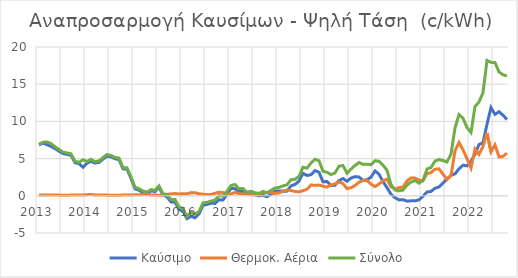
| Category | Καύσιμο | Θερμοκ. Αέρια | Σύνολο |
|---|---|---|---|
| 2013.0 | 6.834 | 0.098 | 6.94 |
| 2013.0 | 7.081 | 0.12 | 7.208 |
| 2013.0 | 6.873 | 0.12 | 7.234 |
| 2013.0 | 6.645 | 0.124 | 7.019 |
| 2013.0 | 6.344 | 0.104 | 6.6 |
| 2013.0 | 6 | 0.094 | 6.233 |
| 2013.0 | 5.672 | 0.075 | 5.873 |
| 2013.0 | 5.566 | 0.074 | 5.763 |
| 2013.0 | 5.441 | 0.092 | 5.649 |
| 2013.0 | 4.459 | 0.104 | 4.64 |
| 2013.0 | 4.32 | 0.112 | 4.503 |
| 2014.0 | 3.838 | 0.096 | 4.838 |
| 2014.0 | 4.385 | 0.152 | 4.621 |
| 2014.0 | 4.632 | 0.177 | 4.903 |
| 2014.0 | 4.405 | 0.111 | 4.595 |
| 2014.0 | 4.494 | 0.117 | 4.691 |
| 2014.0 | 4.928 | 0.106 | 5.135 |
| 2014.0 | 5.33 | 0.095 | 5.543 |
| 2014.0 | 5.23 | 0.074 | 5.417 |
| 2014.0 | 4.982 | 0.073 | 5.166 |
| 2014.0 | 4.873 | 0.084 | 5.065 |
| 2014.0 | 3.62 | 0.095 | 3.771 |
| 2014.0 | 3.583 | 0.108 | 3.763 |
| 2015.0 | 2.34 | 0.098 | 2.522 |
| 2015.0 | 0.94 | 0.137 | 1.158 |
| 2015.0 | 0.741 | 0.156 | 0.964 |
| 2015.0 | 0.419 | 0.16 | 0.651 |
| 2015.0 | 0.262 | 0.174 | 0.481 |
| 2015.0 | 0.665 | 0.11 | 0.835 |
| 2015.0 | 0.576 | 0.101 | 0.745 |
| 2015.0 | 1.163 | 0.08 | 1.343 |
| 2015.0 | 0.102 | 0.068 | 0.262 |
| 2015.0 | -0.146 | 0.208 | 0.167 |
| 2015.0 | -0.832 | 0.251 | -0.498 |
| 2015.0 | -0.864 | 0.302 | -0.49 |
| 2016.0 | -1.807 | 0.252 | -1.494 |
| 2016.0 | -2.111 | 0.277 | -1.747 |
| 2016.0 | -3.067 | 0.266 | -2.748 |
| 2016.0 | -2.759 | 0.427 | -2.246 |
| 2016.0 | -2.942 | 0.414 | -2.473 |
| 2016.0 | -2.435 | 0.274 | -2.106 |
| 2016.0 | -1.275 | 0.205 | -0.958 |
| 2016.0 | -1.158 | 0.168 | -0.884 |
| 2016.0 | -0.995 | 0.182 | -0.708 |
| 2016.0 | -1.025 | 0.338 | -0.584 |
| 2016.0 | -0.538 | 0.482 | 0.033 |
| 2016.0 | -0.565 | 0.437 | -0.055 |
| 2017.0 | 0.214 | 0.262 | 0.604 |
| 2017.0 | 1.011 | 0.246 | 1.387 |
| 2017.0 | 0.952 | 0.454 | 1.514 |
| 2017.0 | 0.55 | 0.296 | 0.953 |
| 2017.0 | 0.636 | 0.252 | 0.981 |
| 2017.0 | 0.196 | 0.201 | 0.477 |
| 2017.0 | 0.339 | 0.146 | 0.606 |
| 2017.0 | 0.122 | 0.152 | 0.4 |
| 2017.0 | -0.011 | 0.217 | 0.323 |
| 2017.0 | 0.056 | 0.414 | 0.594 |
| 2017.0 | -0.129 | 0.452 | 0.4 |
| 2017.0 | 0.188 | 0.449 | 0.725 |
| 2018.0 | 0.626 | 0.32 | 1.05 |
| 2018.0 | 0.653 | 0.386 | 1.125 |
| 2018.0 | 0.625 | 0.616 | 1.323 |
| 2018.0 | 0.628 | 0.76 | 1.488 |
| 2018.0 | 1.332 | 0.717 | 2.16 |
| 2018.0 | 1.53 | 0.583 | 2.219 |
| 2018.0 | 1.979 | 0.534 | 2.615 |
| 2018.0 | 3.006 | 0.693 | 3.835 |
| 2018.0 | 2.732 | 0.869 | 3.717 |
| 2018.0 | 2.836 | 1.445 | 4.407 |
| 2018.0 | 3.388 | 1.416 | 4.913 |
| 2018.0 | 3.162 | 1.443 | 4.706 |
| 2019.0 | 1.878 | 1.303 | 3.301 |
| 2019.0 | 1.92 | 1.173 | 3.161 |
| 2019.0 | 1.372 | 1.452 | 2.856 |
| 2019.0 | 1.425 | 1.614 | 3.074 |
| 2019.0 | 2.056 | 1.875 | 3.985 |
| 2019.0 | 2.314 | 1.629 | 4.066 |
| 2019.0 | 1.957 | 0.969 | 3.043 |
| 2019.0 | 2.382 | 1.084 | 3.586 |
| 2019.0 | 2.574 | 1.383 | 4.074 |
| 2019.0 | 2.529 | 1.817 | 4.478 |
| 2019.0 | 2.078 | 2.052 | 4.216 |
| 2019.0 | 2.164 | 2.053 | 4.259 |
| 2020.0 | 2.499 | 1.57 | 4.178 |
| 2020.0 | 3.342 | 1.235 | 4.716 |
| 2020.0 | 2.902 | 1.592 | 4.64 |
| 2020.0 | 1.908 | 2.033 | 4.118 |
| 2020.0 | 1.094 | 2.215 | 3.43 |
| 2020.0 | 0.211 | 1.214 | 1.541 |
| 2020.0 | -0.25 | 0.904 | 0.781 |
| 2020.0 | -0.55 | 1.106 | 0.658 |
| 2020.0 | -0.513 | 1.168 | 0.763 |
| 2020.0 | -0.719 | 2.003 | 1.436 |
| 2020.0 | -0.68 | 2.389 | 1.845 |
| 2020.0 | -0.68 | 2.389 | 2.059 |
| 2021.0 | -0.54 | 2.099 | 1.687 |
| 2021.0 | -0.057 | 2.013 | 2.078 |
| 2021.0 | 0.518 | 2.981 | 3.601 |
| 2021.0 | 0.585 | 3.118 | 3.801 |
| 2021.0 | 1.019 | 3.569 | 4.657 |
| 2021.0 | 1.185 | 3.624 | 4.882 |
| 2021.0 | 1.724 | 2.896 | 4.741 |
| 2021.0 | 2.249 | 2.182 | 4.544 |
| 2021.0 | 2.769 | 2.715 | 5.612 |
| 2021.0 | 2.954 | 6.045 | 9.129 |
| 2021.0 | 3.622 | 7.163 | 10.919 |
| 2021.0 | 4.113 | 6.188 | 10.431 |
| 2022.0 | 4.02 | 4.996 | 9.163 |
| 2022.0 | 4.67 | 3.738 | 8.506 |
| 2022.0 | 5.571 | 6.291 | 11.986 |
| 2022.0 | 6.89 | 5.562 | 12.606 |
| 2022.0 | 7.13 | 6.649 | 13.852 |
| 2022.0 | 9.626 | 8.44 | 18.192 |
| 2022.0 | 11.861 | 5.91 | 17.936 |
| 2022.0 | 10.941 | 6.838 | 17.904 |
| 2022.0 | 11.303 | 5.221 | 16.658 |
| 2022.0 | 10.824 | 5.298 | 16.264 |
| 2022.0 | 10.257 | 5.733 | 16.114 |